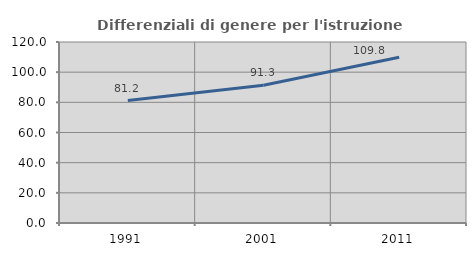
| Category | Differenziali di genere per l'istruzione superiore |
|---|---|
| 1991.0 | 81.212 |
| 2001.0 | 91.31 |
| 2011.0 | 109.845 |